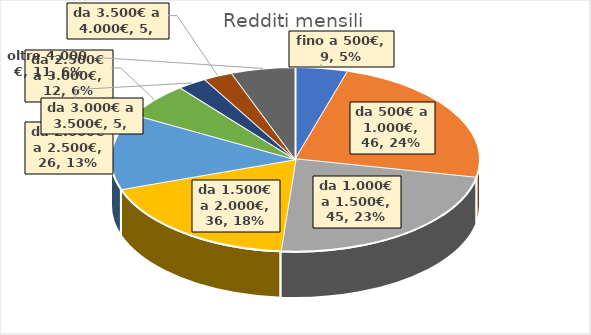
| Category | Series 0 |
|---|---|
| fino a 500€ | 9 |
| da 500€ a 1.000€ | 46 |
| da 1.000€ a 1.500€ | 45 |
| da 1.500€ a 2.000€ | 36 |
| da 2.000€ a 2.500€ | 26 |
| da 2.500€ a 3.000€ | 12 |
| da 3.000€ a 3.500€ | 5 |
| da 3.500€ a 4.000€ | 5 |
| oltre 4.000 € | 11 |